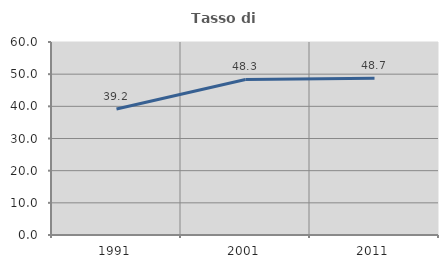
| Category | Tasso di occupazione   |
|---|---|
| 1991.0 | 39.181 |
| 2001.0 | 48.344 |
| 2011.0 | 48.692 |